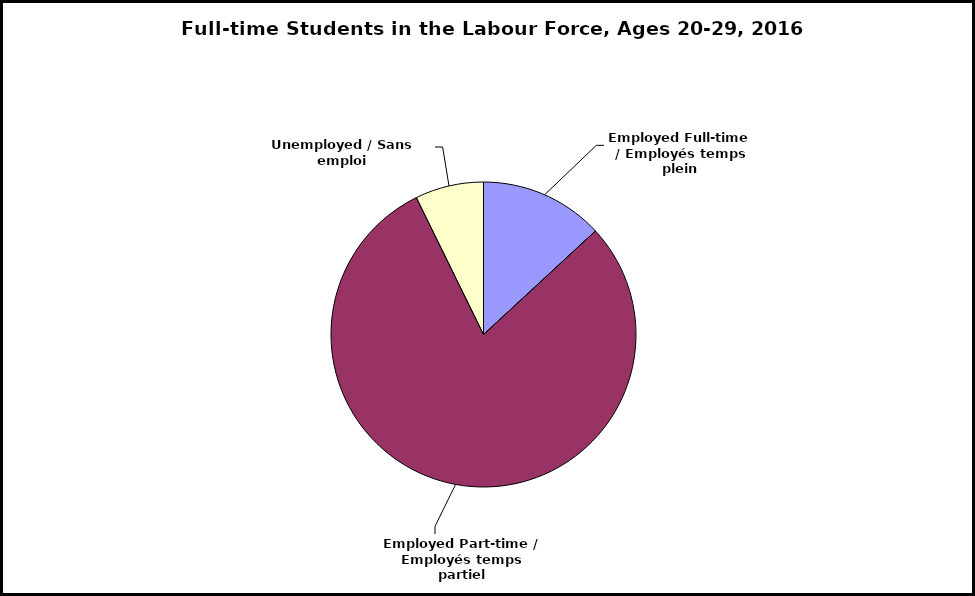
| Category | 2016 |
|---|---|
| Employed Full-time / Employés temps plein | 73900 |
| Employed Part-time / Employés temps partiel | 448500 |
| Unemployed / Sans emploi | 40900 |